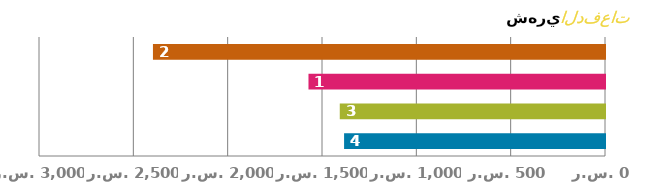
| Category | الدفعة |
|---|---|
| 0 | 1382.921 |
| 1 | 1405.775 |
| 2 | 1571.655 |
| 3 | 2396.046 |